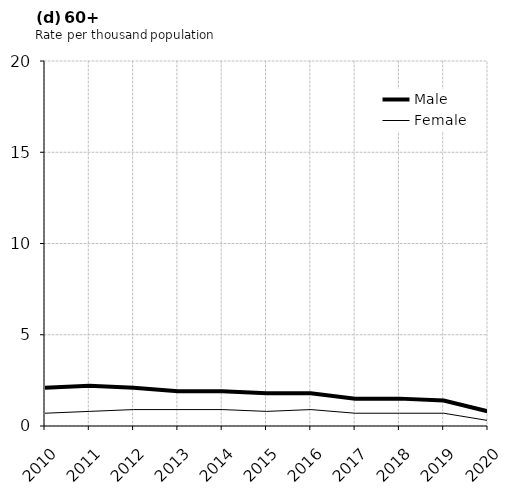
| Category | Male | Female |
|---|---|---|
| 2010.0 | 2.1 | 0.7 |
| 2011.0 | 2.2 | 0.8 |
| 2012.0 | 2.1 | 0.9 |
| 2013.0 | 1.9 | 0.9 |
| 2014.0 | 1.9 | 0.9 |
| 2015.0 | 1.8 | 0.8 |
| 2016.0 | 1.8 | 0.9 |
| 2017.0 | 1.5 | 0.7 |
| 2018.0 | 1.5 | 0.7 |
| 2019.0 | 1.4 | 0.7 |
| 2020.0 | 0.8 | 0.3 |